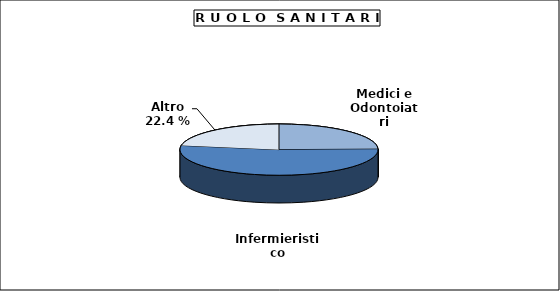
| Category | Personale altri ruoli |
|---|---|
| Medici e Odontoiatri | 906 |
| Infermieristico | 1941 |
| Altro | 821 |